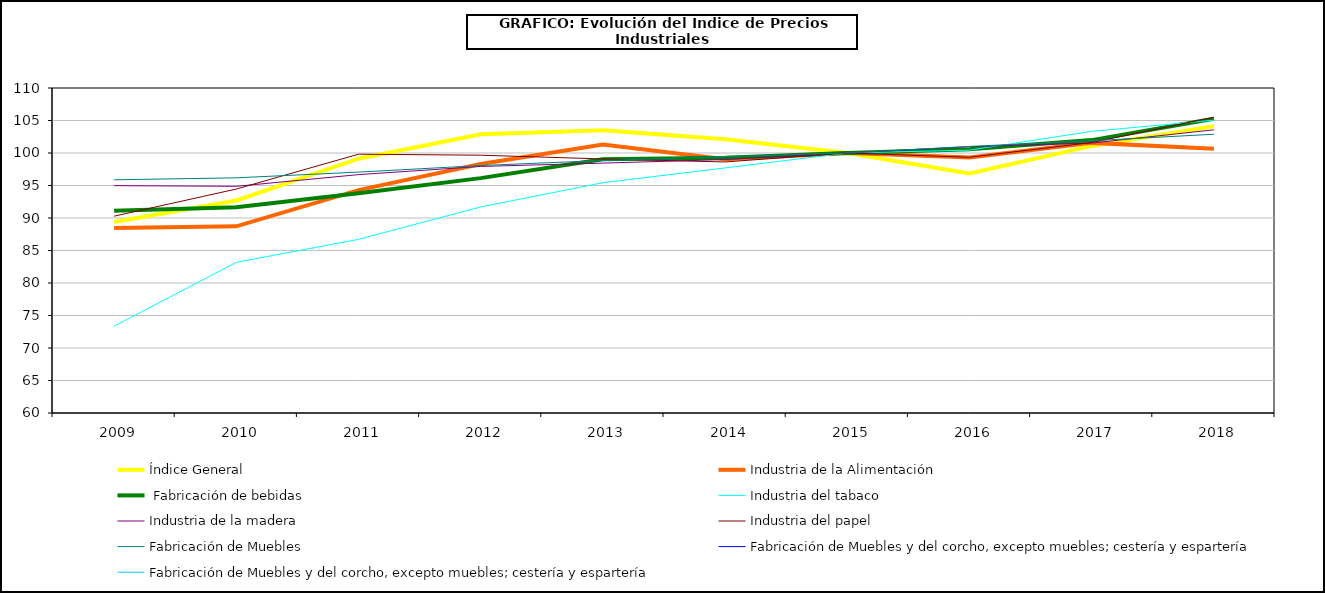
| Category | Índice General | Industria de la Alimentación |  Fabricación de bebidas | Industria del tabaco | Industria de la madera  | Industria del papel | Fabricación de Muebles |
|---|---|---|---|---|---|---|---|
|    2009 | 89.397 | 88.469 | 91.123 | 73.356 | 94.977 | 90.282 |  |
|    2010 | 92.692 | 88.718 | 91.659 | 83.184 | 94.876 | 94.456 |  |
|    2011 | 99.126 | 94.287 | 93.8 | 86.719 | 96.675 | 99.819 |  |
|    2012 | 102.869 | 98.31 | 96.137 | 91.704 | 97.934 | 99.661 |  |
|    2013 | 103.496 | 101.306 | 99.026 | 95.432 | 98.444 | 99.086 |  |
|    2014 | 102.112 | 99.053 | 99.281 | 97.706 | 98.997 | 98.623 |  |
|    2015 | 100 | 100 | 100 | 100 | 100 | 100 |  |
|    2016 | 96.869 | 99.296 | 100.581 | 100.444 | 100.967 | 99.346 |  |
|    2017 | 101.09 | 101.557 | 101.982 | 103.33 | 101.53 | 101.611 |  |
|    2018 | 104.1 | 100.647 | 105.281 | 105.049 | 103.567 | 105.498 |  |